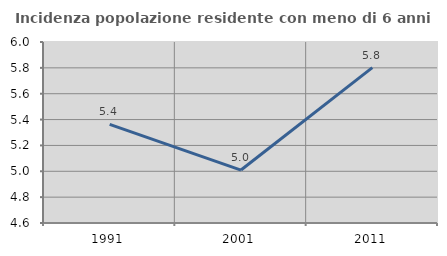
| Category | Incidenza popolazione residente con meno di 6 anni |
|---|---|
| 1991.0 | 5.362 |
| 2001.0 | 5.01 |
| 2011.0 | 5.802 |